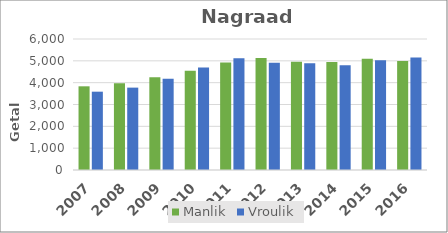
| Category | Manlik | Vroulik |
|---|---|---|
| 2007 | 3833 | 3587 |
| 2008 | 3968 | 3773 |
| 2009 | 4245 | 4180 |
| 2010 | 4542 | 4691 |
| 2011 | 4919 | 5124 |
| 2012 | 5129 | 4914 |
| 2013 | 4963 | 4890 |
| 2014 | 4951 | 4802 |
| 2015 | 5095 | 5024 |
| 2016 | 4996 | 5158 |